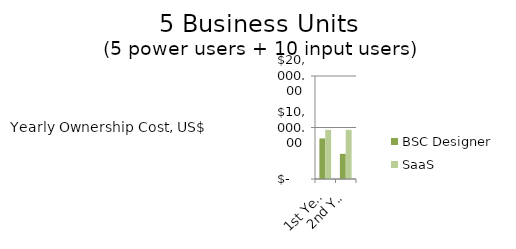
| Category | BSC Designer  | SaaS |
|---|---|---|
| 1st Year | 7880 | 9540 |
| 2nd Year | 4884 | 9540 |